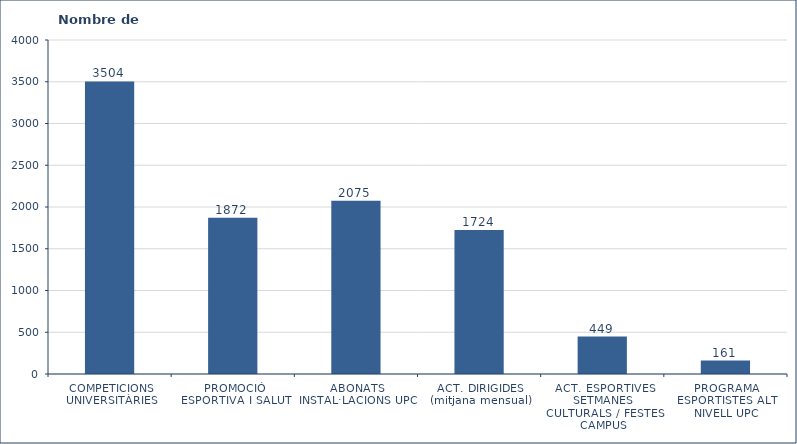
| Category | Nombre de participants |
|---|---|
| COMPETICIONS UNIVERSITÀRIES | 3504 |
| PROMOCIÓ ESPORTIVA I SALUT | 1872 |
| ABONATS INSTAL·LACIONS UPC | 2075 |
| ACT. DIRIGIDES (mitjana mensual) | 1724 |
| ACT. ESPORTIVES SETMANES CULTURALS / FESTES CAMPUS | 449 |
| PROGRAMA ESPORTISTES ALT NIVELL UPC | 161 |